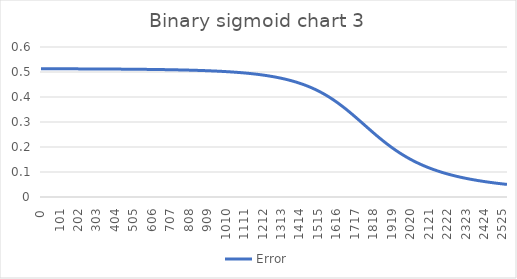
| Category | Error |
|---|---|
| 0.0 | 0.513 |
| 1.0 | 0.513 |
| 2.0 | 0.513 |
| 3.0 | 0.513 |
| 4.0 | 0.513 |
| 5.0 | 0.513 |
| 6.0 | 0.513 |
| 7.0 | 0.513 |
| 8.0 | 0.513 |
| 9.0 | 0.513 |
| 10.0 | 0.513 |
| 11.0 | 0.513 |
| 12.0 | 0.513 |
| 13.0 | 0.513 |
| 14.0 | 0.513 |
| 15.0 | 0.513 |
| 16.0 | 0.513 |
| 17.0 | 0.513 |
| 18.0 | 0.513 |
| 19.0 | 0.513 |
| 20.0 | 0.513 |
| 21.0 | 0.513 |
| 22.0 | 0.513 |
| 23.0 | 0.513 |
| 24.0 | 0.513 |
| 25.0 | 0.513 |
| 26.0 | 0.513 |
| 27.0 | 0.513 |
| 28.0 | 0.513 |
| 29.0 | 0.513 |
| 30.0 | 0.513 |
| 31.0 | 0.513 |
| 32.0 | 0.513 |
| 33.0 | 0.513 |
| 34.0 | 0.513 |
| 35.0 | 0.513 |
| 36.0 | 0.513 |
| 37.0 | 0.513 |
| 38.0 | 0.513 |
| 39.0 | 0.513 |
| 40.0 | 0.513 |
| 41.0 | 0.513 |
| 42.0 | 0.513 |
| 43.0 | 0.513 |
| 44.0 | 0.513 |
| 45.0 | 0.513 |
| 46.0 | 0.513 |
| 47.0 | 0.513 |
| 48.0 | 0.513 |
| 49.0 | 0.513 |
| 50.0 | 0.513 |
| 51.0 | 0.513 |
| 52.0 | 0.513 |
| 53.0 | 0.513 |
| 54.0 | 0.513 |
| 55.0 | 0.513 |
| 56.0 | 0.513 |
| 57.0 | 0.513 |
| 58.0 | 0.513 |
| 59.0 | 0.513 |
| 60.0 | 0.513 |
| 61.0 | 0.513 |
| 62.0 | 0.513 |
| 63.0 | 0.513 |
| 64.0 | 0.513 |
| 65.0 | 0.513 |
| 66.0 | 0.513 |
| 67.0 | 0.513 |
| 68.0 | 0.513 |
| 69.0 | 0.513 |
| 70.0 | 0.513 |
| 71.0 | 0.513 |
| 72.0 | 0.513 |
| 73.0 | 0.513 |
| 74.0 | 0.513 |
| 75.0 | 0.513 |
| 76.0 | 0.513 |
| 77.0 | 0.513 |
| 78.0 | 0.513 |
| 79.0 | 0.513 |
| 80.0 | 0.513 |
| 81.0 | 0.513 |
| 82.0 | 0.513 |
| 83.0 | 0.513 |
| 84.0 | 0.513 |
| 85.0 | 0.513 |
| 86.0 | 0.513 |
| 87.0 | 0.513 |
| 88.0 | 0.513 |
| 89.0 | 0.513 |
| 90.0 | 0.513 |
| 91.0 | 0.513 |
| 92.0 | 0.513 |
| 93.0 | 0.513 |
| 94.0 | 0.513 |
| 95.0 | 0.513 |
| 96.0 | 0.513 |
| 97.0 | 0.513 |
| 98.0 | 0.513 |
| 99.0 | 0.513 |
| 100.0 | 0.513 |
| 101.0 | 0.513 |
| 102.0 | 0.513 |
| 103.0 | 0.513 |
| 104.0 | 0.513 |
| 105.0 | 0.513 |
| 106.0 | 0.513 |
| 107.0 | 0.513 |
| 108.0 | 0.513 |
| 109.0 | 0.513 |
| 110.0 | 0.513 |
| 111.0 | 0.513 |
| 112.0 | 0.513 |
| 113.0 | 0.513 |
| 114.0 | 0.513 |
| 115.0 | 0.513 |
| 116.0 | 0.513 |
| 117.0 | 0.513 |
| 118.0 | 0.513 |
| 119.0 | 0.513 |
| 120.0 | 0.513 |
| 121.0 | 0.513 |
| 122.0 | 0.513 |
| 123.0 | 0.513 |
| 124.0 | 0.513 |
| 125.0 | 0.513 |
| 126.0 | 0.513 |
| 127.0 | 0.513 |
| 128.0 | 0.513 |
| 129.0 | 0.513 |
| 130.0 | 0.513 |
| 131.0 | 0.513 |
| 132.0 | 0.513 |
| 133.0 | 0.513 |
| 134.0 | 0.513 |
| 135.0 | 0.513 |
| 136.0 | 0.513 |
| 137.0 | 0.513 |
| 138.0 | 0.513 |
| 139.0 | 0.513 |
| 140.0 | 0.513 |
| 141.0 | 0.513 |
| 142.0 | 0.513 |
| 143.0 | 0.513 |
| 144.0 | 0.513 |
| 145.0 | 0.513 |
| 146.0 | 0.513 |
| 147.0 | 0.513 |
| 148.0 | 0.513 |
| 149.0 | 0.513 |
| 150.0 | 0.513 |
| 151.0 | 0.513 |
| 152.0 | 0.513 |
| 153.0 | 0.513 |
| 154.0 | 0.513 |
| 155.0 | 0.513 |
| 156.0 | 0.513 |
| 157.0 | 0.513 |
| 158.0 | 0.513 |
| 159.0 | 0.513 |
| 160.0 | 0.513 |
| 161.0 | 0.513 |
| 162.0 | 0.513 |
| 163.0 | 0.513 |
| 164.0 | 0.513 |
| 165.0 | 0.513 |
| 166.0 | 0.513 |
| 167.0 | 0.513 |
| 168.0 | 0.513 |
| 169.0 | 0.513 |
| 170.0 | 0.513 |
| 171.0 | 0.513 |
| 172.0 | 0.513 |
| 173.0 | 0.513 |
| 174.0 | 0.513 |
| 175.0 | 0.513 |
| 176.0 | 0.513 |
| 177.0 | 0.513 |
| 178.0 | 0.513 |
| 179.0 | 0.513 |
| 180.0 | 0.513 |
| 181.0 | 0.513 |
| 182.0 | 0.513 |
| 183.0 | 0.513 |
| 184.0 | 0.513 |
| 185.0 | 0.513 |
| 186.0 | 0.513 |
| 187.0 | 0.513 |
| 188.0 | 0.513 |
| 189.0 | 0.513 |
| 190.0 | 0.513 |
| 191.0 | 0.513 |
| 192.0 | 0.513 |
| 193.0 | 0.513 |
| 194.0 | 0.513 |
| 195.0 | 0.513 |
| 196.0 | 0.513 |
| 197.0 | 0.513 |
| 198.0 | 0.513 |
| 199.0 | 0.513 |
| 200.0 | 0.513 |
| 201.0 | 0.513 |
| 202.0 | 0.513 |
| 203.0 | 0.512 |
| 204.0 | 0.512 |
| 205.0 | 0.512 |
| 206.0 | 0.512 |
| 207.0 | 0.512 |
| 208.0 | 0.512 |
| 209.0 | 0.512 |
| 210.0 | 0.512 |
| 211.0 | 0.512 |
| 212.0 | 0.512 |
| 213.0 | 0.512 |
| 214.0 | 0.512 |
| 215.0 | 0.512 |
| 216.0 | 0.512 |
| 217.0 | 0.512 |
| 218.0 | 0.512 |
| 219.0 | 0.512 |
| 220.0 | 0.512 |
| 221.0 | 0.512 |
| 222.0 | 0.512 |
| 223.0 | 0.512 |
| 224.0 | 0.512 |
| 225.0 | 0.512 |
| 226.0 | 0.512 |
| 227.0 | 0.512 |
| 228.0 | 0.512 |
| 229.0 | 0.512 |
| 230.0 | 0.512 |
| 231.0 | 0.512 |
| 232.0 | 0.512 |
| 233.0 | 0.512 |
| 234.0 | 0.512 |
| 235.0 | 0.512 |
| 236.0 | 0.512 |
| 237.0 | 0.512 |
| 238.0 | 0.512 |
| 239.0 | 0.512 |
| 240.0 | 0.512 |
| 241.0 | 0.512 |
| 242.0 | 0.512 |
| 243.0 | 0.512 |
| 244.0 | 0.512 |
| 245.0 | 0.512 |
| 246.0 | 0.512 |
| 247.0 | 0.512 |
| 248.0 | 0.512 |
| 249.0 | 0.512 |
| 250.0 | 0.512 |
| 251.0 | 0.512 |
| 252.0 | 0.512 |
| 253.0 | 0.512 |
| 254.0 | 0.512 |
| 255.0 | 0.512 |
| 256.0 | 0.512 |
| 257.0 | 0.512 |
| 258.0 | 0.512 |
| 259.0 | 0.512 |
| 260.0 | 0.512 |
| 261.0 | 0.512 |
| 262.0 | 0.512 |
| 263.0 | 0.512 |
| 264.0 | 0.512 |
| 265.0 | 0.512 |
| 266.0 | 0.512 |
| 267.0 | 0.512 |
| 268.0 | 0.512 |
| 269.0 | 0.512 |
| 270.0 | 0.512 |
| 271.0 | 0.512 |
| 272.0 | 0.512 |
| 273.0 | 0.512 |
| 274.0 | 0.512 |
| 275.0 | 0.512 |
| 276.0 | 0.512 |
| 277.0 | 0.512 |
| 278.0 | 0.512 |
| 279.0 | 0.512 |
| 280.0 | 0.512 |
| 281.0 | 0.512 |
| 282.0 | 0.512 |
| 283.0 | 0.512 |
| 284.0 | 0.512 |
| 285.0 | 0.512 |
| 286.0 | 0.512 |
| 287.0 | 0.512 |
| 288.0 | 0.512 |
| 289.0 | 0.512 |
| 290.0 | 0.512 |
| 291.0 | 0.512 |
| 292.0 | 0.512 |
| 293.0 | 0.512 |
| 294.0 | 0.512 |
| 295.0 | 0.512 |
| 296.0 | 0.512 |
| 297.0 | 0.512 |
| 298.0 | 0.512 |
| 299.0 | 0.512 |
| 300.0 | 0.512 |
| 301.0 | 0.512 |
| 302.0 | 0.512 |
| 303.0 | 0.512 |
| 304.0 | 0.512 |
| 305.0 | 0.512 |
| 306.0 | 0.512 |
| 307.0 | 0.512 |
| 308.0 | 0.512 |
| 309.0 | 0.512 |
| 310.0 | 0.512 |
| 311.0 | 0.512 |
| 312.0 | 0.512 |
| 313.0 | 0.512 |
| 314.0 | 0.512 |
| 315.0 | 0.512 |
| 316.0 | 0.512 |
| 317.0 | 0.512 |
| 318.0 | 0.512 |
| 319.0 | 0.512 |
| 320.0 | 0.512 |
| 321.0 | 0.512 |
| 322.0 | 0.512 |
| 323.0 | 0.512 |
| 324.0 | 0.512 |
| 325.0 | 0.512 |
| 326.0 | 0.512 |
| 327.0 | 0.512 |
| 328.0 | 0.512 |
| 329.0 | 0.512 |
| 330.0 | 0.512 |
| 331.0 | 0.512 |
| 332.0 | 0.512 |
| 333.0 | 0.512 |
| 334.0 | 0.512 |
| 335.0 | 0.512 |
| 336.0 | 0.512 |
| 337.0 | 0.512 |
| 338.0 | 0.512 |
| 339.0 | 0.512 |
| 340.0 | 0.512 |
| 341.0 | 0.512 |
| 342.0 | 0.512 |
| 343.0 | 0.512 |
| 344.0 | 0.512 |
| 345.0 | 0.512 |
| 346.0 | 0.512 |
| 347.0 | 0.512 |
| 348.0 | 0.512 |
| 349.0 | 0.512 |
| 350.0 | 0.512 |
| 351.0 | 0.512 |
| 352.0 | 0.512 |
| 353.0 | 0.512 |
| 354.0 | 0.512 |
| 355.0 | 0.512 |
| 356.0 | 0.512 |
| 357.0 | 0.512 |
| 358.0 | 0.512 |
| 359.0 | 0.512 |
| 360.0 | 0.512 |
| 361.0 | 0.512 |
| 362.0 | 0.512 |
| 363.0 | 0.512 |
| 364.0 | 0.512 |
| 365.0 | 0.512 |
| 366.0 | 0.512 |
| 367.0 | 0.512 |
| 368.0 | 0.512 |
| 369.0 | 0.512 |
| 370.0 | 0.512 |
| 371.0 | 0.512 |
| 372.0 | 0.512 |
| 373.0 | 0.512 |
| 374.0 | 0.512 |
| 375.0 | 0.512 |
| 376.0 | 0.512 |
| 377.0 | 0.512 |
| 378.0 | 0.512 |
| 379.0 | 0.512 |
| 380.0 | 0.512 |
| 381.0 | 0.512 |
| 382.0 | 0.512 |
| 383.0 | 0.512 |
| 384.0 | 0.512 |
| 385.0 | 0.512 |
| 386.0 | 0.512 |
| 387.0 | 0.512 |
| 388.0 | 0.512 |
| 389.0 | 0.512 |
| 390.0 | 0.512 |
| 391.0 | 0.512 |
| 392.0 | 0.512 |
| 393.0 | 0.512 |
| 394.0 | 0.512 |
| 395.0 | 0.512 |
| 396.0 | 0.512 |
| 397.0 | 0.512 |
| 398.0 | 0.512 |
| 399.0 | 0.512 |
| 400.0 | 0.512 |
| 401.0 | 0.512 |
| 402.0 | 0.512 |
| 403.0 | 0.512 |
| 404.0 | 0.512 |
| 405.0 | 0.512 |
| 406.0 | 0.512 |
| 407.0 | 0.512 |
| 408.0 | 0.512 |
| 409.0 | 0.512 |
| 410.0 | 0.512 |
| 411.0 | 0.512 |
| 412.0 | 0.512 |
| 413.0 | 0.512 |
| 414.0 | 0.512 |
| 415.0 | 0.512 |
| 416.0 | 0.512 |
| 417.0 | 0.512 |
| 418.0 | 0.512 |
| 419.0 | 0.512 |
| 420.0 | 0.512 |
| 421.0 | 0.512 |
| 422.0 | 0.512 |
| 423.0 | 0.512 |
| 424.0 | 0.512 |
| 425.0 | 0.512 |
| 426.0 | 0.512 |
| 427.0 | 0.512 |
| 428.0 | 0.512 |
| 429.0 | 0.512 |
| 430.0 | 0.512 |
| 431.0 | 0.512 |
| 432.0 | 0.512 |
| 433.0 | 0.512 |
| 434.0 | 0.512 |
| 435.0 | 0.512 |
| 436.0 | 0.511 |
| 437.0 | 0.511 |
| 438.0 | 0.511 |
| 439.0 | 0.511 |
| 440.0 | 0.511 |
| 441.0 | 0.511 |
| 442.0 | 0.511 |
| 443.0 | 0.511 |
| 444.0 | 0.511 |
| 445.0 | 0.511 |
| 446.0 | 0.511 |
| 447.0 | 0.511 |
| 448.0 | 0.511 |
| 449.0 | 0.511 |
| 450.0 | 0.511 |
| 451.0 | 0.511 |
| 452.0 | 0.511 |
| 453.0 | 0.511 |
| 454.0 | 0.511 |
| 455.0 | 0.511 |
| 456.0 | 0.511 |
| 457.0 | 0.511 |
| 458.0 | 0.511 |
| 459.0 | 0.511 |
| 460.0 | 0.511 |
| 461.0 | 0.511 |
| 462.0 | 0.511 |
| 463.0 | 0.511 |
| 464.0 | 0.511 |
| 465.0 | 0.511 |
| 466.0 | 0.511 |
| 467.0 | 0.511 |
| 468.0 | 0.511 |
| 469.0 | 0.511 |
| 470.0 | 0.511 |
| 471.0 | 0.511 |
| 472.0 | 0.511 |
| 473.0 | 0.511 |
| 474.0 | 0.511 |
| 475.0 | 0.511 |
| 476.0 | 0.511 |
| 477.0 | 0.511 |
| 478.0 | 0.511 |
| 479.0 | 0.511 |
| 480.0 | 0.511 |
| 481.0 | 0.511 |
| 482.0 | 0.511 |
| 483.0 | 0.511 |
| 484.0 | 0.511 |
| 485.0 | 0.511 |
| 486.0 | 0.511 |
| 487.0 | 0.511 |
| 488.0 | 0.511 |
| 489.0 | 0.511 |
| 490.0 | 0.511 |
| 491.0 | 0.511 |
| 492.0 | 0.511 |
| 493.0 | 0.511 |
| 494.0 | 0.511 |
| 495.0 | 0.511 |
| 496.0 | 0.511 |
| 497.0 | 0.511 |
| 498.0 | 0.511 |
| 499.0 | 0.511 |
| 500.0 | 0.511 |
| 501.0 | 0.511 |
| 502.0 | 0.511 |
| 503.0 | 0.511 |
| 504.0 | 0.511 |
| 505.0 | 0.511 |
| 506.0 | 0.511 |
| 507.0 | 0.511 |
| 508.0 | 0.511 |
| 509.0 | 0.511 |
| 510.0 | 0.511 |
| 511.0 | 0.511 |
| 512.0 | 0.511 |
| 513.0 | 0.511 |
| 514.0 | 0.511 |
| 515.0 | 0.511 |
| 516.0 | 0.511 |
| 517.0 | 0.511 |
| 518.0 | 0.511 |
| 519.0 | 0.511 |
| 520.0 | 0.511 |
| 521.0 | 0.511 |
| 522.0 | 0.511 |
| 523.0 | 0.511 |
| 524.0 | 0.511 |
| 525.0 | 0.511 |
| 526.0 | 0.511 |
| 527.0 | 0.511 |
| 528.0 | 0.511 |
| 529.0 | 0.511 |
| 530.0 | 0.511 |
| 531.0 | 0.511 |
| 532.0 | 0.511 |
| 533.0 | 0.511 |
| 534.0 | 0.511 |
| 535.0 | 0.511 |
| 536.0 | 0.511 |
| 537.0 | 0.511 |
| 538.0 | 0.511 |
| 539.0 | 0.511 |
| 540.0 | 0.511 |
| 541.0 | 0.511 |
| 542.0 | 0.511 |
| 543.0 | 0.511 |
| 544.0 | 0.511 |
| 545.0 | 0.511 |
| 546.0 | 0.511 |
| 547.0 | 0.511 |
| 548.0 | 0.511 |
| 549.0 | 0.511 |
| 550.0 | 0.511 |
| 551.0 | 0.511 |
| 552.0 | 0.511 |
| 553.0 | 0.511 |
| 554.0 | 0.511 |
| 555.0 | 0.511 |
| 556.0 | 0.511 |
| 557.0 | 0.511 |
| 558.0 | 0.511 |
| 559.0 | 0.511 |
| 560.0 | 0.511 |
| 561.0 | 0.511 |
| 562.0 | 0.511 |
| 563.0 | 0.511 |
| 564.0 | 0.511 |
| 565.0 | 0.511 |
| 566.0 | 0.511 |
| 567.0 | 0.511 |
| 568.0 | 0.511 |
| 569.0 | 0.511 |
| 570.0 | 0.511 |
| 571.0 | 0.511 |
| 572.0 | 0.511 |
| 573.0 | 0.511 |
| 574.0 | 0.511 |
| 575.0 | 0.511 |
| 576.0 | 0.511 |
| 577.0 | 0.511 |
| 578.0 | 0.51 |
| 579.0 | 0.51 |
| 580.0 | 0.51 |
| 581.0 | 0.51 |
| 582.0 | 0.51 |
| 583.0 | 0.51 |
| 584.0 | 0.51 |
| 585.0 | 0.51 |
| 586.0 | 0.51 |
| 587.0 | 0.51 |
| 588.0 | 0.51 |
| 589.0 | 0.51 |
| 590.0 | 0.51 |
| 591.0 | 0.51 |
| 592.0 | 0.51 |
| 593.0 | 0.51 |
| 594.0 | 0.51 |
| 595.0 | 0.51 |
| 596.0 | 0.51 |
| 597.0 | 0.51 |
| 598.0 | 0.51 |
| 599.0 | 0.51 |
| 600.0 | 0.51 |
| 601.0 | 0.51 |
| 602.0 | 0.51 |
| 603.0 | 0.51 |
| 604.0 | 0.51 |
| 605.0 | 0.51 |
| 606.0 | 0.51 |
| 607.0 | 0.51 |
| 608.0 | 0.51 |
| 609.0 | 0.51 |
| 610.0 | 0.51 |
| 611.0 | 0.51 |
| 612.0 | 0.51 |
| 613.0 | 0.51 |
| 614.0 | 0.51 |
| 615.0 | 0.51 |
| 616.0 | 0.51 |
| 617.0 | 0.51 |
| 618.0 | 0.51 |
| 619.0 | 0.51 |
| 620.0 | 0.51 |
| 621.0 | 0.51 |
| 622.0 | 0.51 |
| 623.0 | 0.51 |
| 624.0 | 0.51 |
| 625.0 | 0.51 |
| 626.0 | 0.51 |
| 627.0 | 0.51 |
| 628.0 | 0.51 |
| 629.0 | 0.51 |
| 630.0 | 0.51 |
| 631.0 | 0.51 |
| 632.0 | 0.51 |
| 633.0 | 0.51 |
| 634.0 | 0.51 |
| 635.0 | 0.51 |
| 636.0 | 0.51 |
| 637.0 | 0.51 |
| 638.0 | 0.51 |
| 639.0 | 0.51 |
| 640.0 | 0.51 |
| 641.0 | 0.51 |
| 642.0 | 0.51 |
| 643.0 | 0.51 |
| 644.0 | 0.51 |
| 645.0 | 0.51 |
| 646.0 | 0.51 |
| 647.0 | 0.51 |
| 648.0 | 0.51 |
| 649.0 | 0.51 |
| 650.0 | 0.51 |
| 651.0 | 0.51 |
| 652.0 | 0.51 |
| 653.0 | 0.51 |
| 654.0 | 0.51 |
| 655.0 | 0.51 |
| 656.0 | 0.51 |
| 657.0 | 0.51 |
| 658.0 | 0.51 |
| 659.0 | 0.51 |
| 660.0 | 0.51 |
| 661.0 | 0.51 |
| 662.0 | 0.51 |
| 663.0 | 0.51 |
| 664.0 | 0.51 |
| 665.0 | 0.51 |
| 666.0 | 0.51 |
| 667.0 | 0.51 |
| 668.0 | 0.51 |
| 669.0 | 0.51 |
| 670.0 | 0.51 |
| 671.0 | 0.51 |
| 672.0 | 0.51 |
| 673.0 | 0.51 |
| 674.0 | 0.51 |
| 675.0 | 0.51 |
| 676.0 | 0.51 |
| 677.0 | 0.509 |
| 678.0 | 0.509 |
| 679.0 | 0.509 |
| 680.0 | 0.509 |
| 681.0 | 0.509 |
| 682.0 | 0.509 |
| 683.0 | 0.509 |
| 684.0 | 0.509 |
| 685.0 | 0.509 |
| 686.0 | 0.509 |
| 687.0 | 0.509 |
| 688.0 | 0.509 |
| 689.0 | 0.509 |
| 690.0 | 0.509 |
| 691.0 | 0.509 |
| 692.0 | 0.509 |
| 693.0 | 0.509 |
| 694.0 | 0.509 |
| 695.0 | 0.509 |
| 696.0 | 0.509 |
| 697.0 | 0.509 |
| 698.0 | 0.509 |
| 699.0 | 0.509 |
| 700.0 | 0.509 |
| 701.0 | 0.509 |
| 702.0 | 0.509 |
| 703.0 | 0.509 |
| 704.0 | 0.509 |
| 705.0 | 0.509 |
| 706.0 | 0.509 |
| 707.0 | 0.509 |
| 708.0 | 0.509 |
| 709.0 | 0.509 |
| 710.0 | 0.509 |
| 711.0 | 0.509 |
| 712.0 | 0.509 |
| 713.0 | 0.509 |
| 714.0 | 0.509 |
| 715.0 | 0.509 |
| 716.0 | 0.509 |
| 717.0 | 0.509 |
| 718.0 | 0.509 |
| 719.0 | 0.509 |
| 720.0 | 0.509 |
| 721.0 | 0.509 |
| 722.0 | 0.509 |
| 723.0 | 0.509 |
| 724.0 | 0.509 |
| 725.0 | 0.509 |
| 726.0 | 0.509 |
| 727.0 | 0.509 |
| 728.0 | 0.509 |
| 729.0 | 0.509 |
| 730.0 | 0.509 |
| 731.0 | 0.509 |
| 732.0 | 0.509 |
| 733.0 | 0.509 |
| 734.0 | 0.509 |
| 735.0 | 0.509 |
| 736.0 | 0.509 |
| 737.0 | 0.509 |
| 738.0 | 0.509 |
| 739.0 | 0.509 |
| 740.0 | 0.509 |
| 741.0 | 0.509 |
| 742.0 | 0.509 |
| 743.0 | 0.509 |
| 744.0 | 0.509 |
| 745.0 | 0.509 |
| 746.0 | 0.509 |
| 747.0 | 0.509 |
| 748.0 | 0.509 |
| 749.0 | 0.509 |
| 750.0 | 0.509 |
| 751.0 | 0.508 |
| 752.0 | 0.508 |
| 753.0 | 0.508 |
| 754.0 | 0.508 |
| 755.0 | 0.508 |
| 756.0 | 0.508 |
| 757.0 | 0.508 |
| 758.0 | 0.508 |
| 759.0 | 0.508 |
| 760.0 | 0.508 |
| 761.0 | 0.508 |
| 762.0 | 0.508 |
| 763.0 | 0.508 |
| 764.0 | 0.508 |
| 765.0 | 0.508 |
| 766.0 | 0.508 |
| 767.0 | 0.508 |
| 768.0 | 0.508 |
| 769.0 | 0.508 |
| 770.0 | 0.508 |
| 771.0 | 0.508 |
| 772.0 | 0.508 |
| 773.0 | 0.508 |
| 774.0 | 0.508 |
| 775.0 | 0.508 |
| 776.0 | 0.508 |
| 777.0 | 0.508 |
| 778.0 | 0.508 |
| 779.0 | 0.508 |
| 780.0 | 0.508 |
| 781.0 | 0.508 |
| 782.0 | 0.508 |
| 783.0 | 0.508 |
| 784.0 | 0.508 |
| 785.0 | 0.508 |
| 786.0 | 0.508 |
| 787.0 | 0.508 |
| 788.0 | 0.508 |
| 789.0 | 0.508 |
| 790.0 | 0.508 |
| 791.0 | 0.508 |
| 792.0 | 0.508 |
| 793.0 | 0.508 |
| 794.0 | 0.508 |
| 795.0 | 0.508 |
| 796.0 | 0.508 |
| 797.0 | 0.508 |
| 798.0 | 0.508 |
| 799.0 | 0.508 |
| 800.0 | 0.508 |
| 801.0 | 0.508 |
| 802.0 | 0.508 |
| 803.0 | 0.508 |
| 804.0 | 0.508 |
| 805.0 | 0.508 |
| 806.0 | 0.508 |
| 807.0 | 0.508 |
| 808.0 | 0.508 |
| 809.0 | 0.507 |
| 810.0 | 0.507 |
| 811.0 | 0.507 |
| 812.0 | 0.507 |
| 813.0 | 0.507 |
| 814.0 | 0.507 |
| 815.0 | 0.507 |
| 816.0 | 0.507 |
| 817.0 | 0.507 |
| 818.0 | 0.507 |
| 819.0 | 0.507 |
| 820.0 | 0.507 |
| 821.0 | 0.507 |
| 822.0 | 0.507 |
| 823.0 | 0.507 |
| 824.0 | 0.507 |
| 825.0 | 0.507 |
| 826.0 | 0.507 |
| 827.0 | 0.507 |
| 828.0 | 0.507 |
| 829.0 | 0.507 |
| 830.0 | 0.507 |
| 831.0 | 0.507 |
| 832.0 | 0.507 |
| 833.0 | 0.507 |
| 834.0 | 0.507 |
| 835.0 | 0.507 |
| 836.0 | 0.507 |
| 837.0 | 0.507 |
| 838.0 | 0.507 |
| 839.0 | 0.507 |
| 840.0 | 0.507 |
| 841.0 | 0.507 |
| 842.0 | 0.507 |
| 843.0 | 0.507 |
| 844.0 | 0.507 |
| 845.0 | 0.507 |
| 846.0 | 0.507 |
| 847.0 | 0.507 |
| 848.0 | 0.507 |
| 849.0 | 0.507 |
| 850.0 | 0.507 |
| 851.0 | 0.507 |
| 852.0 | 0.507 |
| 853.0 | 0.507 |
| 854.0 | 0.507 |
| 855.0 | 0.507 |
| 856.0 | 0.507 |
| 857.0 | 0.506 |
| 858.0 | 0.506 |
| 859.0 | 0.506 |
| 860.0 | 0.506 |
| 861.0 | 0.506 |
| 862.0 | 0.506 |
| 863.0 | 0.506 |
| 864.0 | 0.506 |
| 865.0 | 0.506 |
| 866.0 | 0.506 |
| 867.0 | 0.506 |
| 868.0 | 0.506 |
| 869.0 | 0.506 |
| 870.0 | 0.506 |
| 871.0 | 0.506 |
| 872.0 | 0.506 |
| 873.0 | 0.506 |
| 874.0 | 0.506 |
| 875.0 | 0.506 |
| 876.0 | 0.506 |
| 877.0 | 0.506 |
| 878.0 | 0.506 |
| 879.0 | 0.506 |
| 880.0 | 0.506 |
| 881.0 | 0.506 |
| 882.0 | 0.506 |
| 883.0 | 0.506 |
| 884.0 | 0.506 |
| 885.0 | 0.506 |
| 886.0 | 0.506 |
| 887.0 | 0.506 |
| 888.0 | 0.506 |
| 889.0 | 0.506 |
| 890.0 | 0.506 |
| 891.0 | 0.506 |
| 892.0 | 0.506 |
| 893.0 | 0.506 |
| 894.0 | 0.506 |
| 895.0 | 0.506 |
| 896.0 | 0.506 |
| 897.0 | 0.505 |
| 898.0 | 0.505 |
| 899.0 | 0.505 |
| 900.0 | 0.505 |
| 901.0 | 0.505 |
| 902.0 | 0.505 |
| 903.0 | 0.505 |
| 904.0 | 0.505 |
| 905.0 | 0.505 |
| 906.0 | 0.505 |
| 907.0 | 0.505 |
| 908.0 | 0.505 |
| 909.0 | 0.505 |
| 910.0 | 0.505 |
| 911.0 | 0.505 |
| 912.0 | 0.505 |
| 913.0 | 0.505 |
| 914.0 | 0.505 |
| 915.0 | 0.505 |
| 916.0 | 0.505 |
| 917.0 | 0.505 |
| 918.0 | 0.505 |
| 919.0 | 0.505 |
| 920.0 | 0.505 |
| 921.0 | 0.505 |
| 922.0 | 0.505 |
| 923.0 | 0.505 |
| 924.0 | 0.505 |
| 925.0 | 0.505 |
| 926.0 | 0.505 |
| 927.0 | 0.505 |
| 928.0 | 0.505 |
| 929.0 | 0.505 |
| 930.0 | 0.505 |
| 931.0 | 0.505 |
| 932.0 | 0.504 |
| 933.0 | 0.504 |
| 934.0 | 0.504 |
| 935.0 | 0.504 |
| 936.0 | 0.504 |
| 937.0 | 0.504 |
| 938.0 | 0.504 |
| 939.0 | 0.504 |
| 940.0 | 0.504 |
| 941.0 | 0.504 |
| 942.0 | 0.504 |
| 943.0 | 0.504 |
| 944.0 | 0.504 |
| 945.0 | 0.504 |
| 946.0 | 0.504 |
| 947.0 | 0.504 |
| 948.0 | 0.504 |
| 949.0 | 0.504 |
| 950.0 | 0.504 |
| 951.0 | 0.504 |
| 952.0 | 0.504 |
| 953.0 | 0.504 |
| 954.0 | 0.504 |
| 955.0 | 0.504 |
| 956.0 | 0.504 |
| 957.0 | 0.504 |
| 958.0 | 0.504 |
| 959.0 | 0.504 |
| 960.0 | 0.504 |
| 961.0 | 0.504 |
| 962.0 | 0.504 |
| 963.0 | 0.503 |
| 964.0 | 0.503 |
| 965.0 | 0.503 |
| 966.0 | 0.503 |
| 967.0 | 0.503 |
| 968.0 | 0.503 |
| 969.0 | 0.503 |
| 970.0 | 0.503 |
| 971.0 | 0.503 |
| 972.0 | 0.503 |
| 973.0 | 0.503 |
| 974.0 | 0.503 |
| 975.0 | 0.503 |
| 976.0 | 0.503 |
| 977.0 | 0.503 |
| 978.0 | 0.503 |
| 979.0 | 0.503 |
| 980.0 | 0.503 |
| 981.0 | 0.503 |
| 982.0 | 0.503 |
| 983.0 | 0.503 |
| 984.0 | 0.503 |
| 985.0 | 0.503 |
| 986.0 | 0.503 |
| 987.0 | 0.503 |
| 988.0 | 0.503 |
| 989.0 | 0.503 |
| 990.0 | 0.502 |
| 991.0 | 0.502 |
| 992.0 | 0.502 |
| 993.0 | 0.502 |
| 994.0 | 0.502 |
| 995.0 | 0.502 |
| 996.0 | 0.502 |
| 997.0 | 0.502 |
| 998.0 | 0.502 |
| 999.0 | 0.502 |
| 1000.0 | 0.502 |
| 1001.0 | 0.502 |
| 1002.0 | 0.502 |
| 1003.0 | 0.502 |
| 1004.0 | 0.502 |
| 1005.0 | 0.502 |
| 1006.0 | 0.502 |
| 1007.0 | 0.502 |
| 1008.0 | 0.502 |
| 1009.0 | 0.502 |
| 1010.0 | 0.502 |
| 1011.0 | 0.502 |
| 1012.0 | 0.502 |
| 1013.0 | 0.502 |
| 1014.0 | 0.501 |
| 1015.0 | 0.501 |
| 1016.0 | 0.501 |
| 1017.0 | 0.501 |
| 1018.0 | 0.501 |
| 1019.0 | 0.501 |
| 1020.0 | 0.501 |
| 1021.0 | 0.501 |
| 1022.0 | 0.501 |
| 1023.0 | 0.501 |
| 1024.0 | 0.501 |
| 1025.0 | 0.501 |
| 1026.0 | 0.501 |
| 1027.0 | 0.501 |
| 1028.0 | 0.501 |
| 1029.0 | 0.501 |
| 1030.0 | 0.501 |
| 1031.0 | 0.501 |
| 1032.0 | 0.501 |
| 1033.0 | 0.501 |
| 1034.0 | 0.501 |
| 1035.0 | 0.501 |
| 1036.0 | 0.5 |
| 1037.0 | 0.5 |
| 1038.0 | 0.5 |
| 1039.0 | 0.5 |
| 1040.0 | 0.5 |
| 1041.0 | 0.5 |
| 1042.0 | 0.5 |
| 1043.0 | 0.5 |
| 1044.0 | 0.5 |
| 1045.0 | 0.5 |
| 1046.0 | 0.5 |
| 1047.0 | 0.5 |
| 1048.0 | 0.5 |
| 1049.0 | 0.5 |
| 1050.0 | 0.5 |
| 1051.0 | 0.5 |
| 1052.0 | 0.5 |
| 1053.0 | 0.5 |
| 1054.0 | 0.5 |
| 1055.0 | 0.5 |
| 1056.0 | 0.499 |
| 1057.0 | 0.499 |
| 1058.0 | 0.499 |
| 1059.0 | 0.499 |
| 1060.0 | 0.499 |
| 1061.0 | 0.499 |
| 1062.0 | 0.499 |
| 1063.0 | 0.499 |
| 1064.0 | 0.499 |
| 1065.0 | 0.499 |
| 1066.0 | 0.499 |
| 1067.0 | 0.499 |
| 1068.0 | 0.499 |
| 1069.0 | 0.499 |
| 1070.0 | 0.499 |
| 1071.0 | 0.499 |
| 1072.0 | 0.499 |
| 1073.0 | 0.499 |
| 1074.0 | 0.499 |
| 1075.0 | 0.498 |
| 1076.0 | 0.498 |
| 1077.0 | 0.498 |
| 1078.0 | 0.498 |
| 1079.0 | 0.498 |
| 1080.0 | 0.498 |
| 1081.0 | 0.498 |
| 1082.0 | 0.498 |
| 1083.0 | 0.498 |
| 1084.0 | 0.498 |
| 1085.0 | 0.498 |
| 1086.0 | 0.498 |
| 1087.0 | 0.498 |
| 1088.0 | 0.498 |
| 1089.0 | 0.498 |
| 1090.0 | 0.498 |
| 1091.0 | 0.498 |
| 1092.0 | 0.497 |
| 1093.0 | 0.497 |
| 1094.0 | 0.497 |
| 1095.0 | 0.497 |
| 1096.0 | 0.497 |
| 1097.0 | 0.497 |
| 1098.0 | 0.497 |
| 1099.0 | 0.497 |
| 1100.0 | 0.497 |
| 1101.0 | 0.497 |
| 1102.0 | 0.497 |
| 1103.0 | 0.497 |
| 1104.0 | 0.497 |
| 1105.0 | 0.497 |
| 1106.0 | 0.497 |
| 1107.0 | 0.497 |
| 1108.0 | 0.496 |
| 1109.0 | 0.496 |
| 1110.0 | 0.496 |
| 1111.0 | 0.496 |
| 1112.0 | 0.496 |
| 1113.0 | 0.496 |
| 1114.0 | 0.496 |
| 1115.0 | 0.496 |
| 1116.0 | 0.496 |
| 1117.0 | 0.496 |
| 1118.0 | 0.496 |
| 1119.0 | 0.496 |
| 1120.0 | 0.496 |
| 1121.0 | 0.496 |
| 1122.0 | 0.496 |
| 1123.0 | 0.495 |
| 1124.0 | 0.495 |
| 1125.0 | 0.495 |
| 1126.0 | 0.495 |
| 1127.0 | 0.495 |
| 1128.0 | 0.495 |
| 1129.0 | 0.495 |
| 1130.0 | 0.495 |
| 1131.0 | 0.495 |
| 1132.0 | 0.495 |
| 1133.0 | 0.495 |
| 1134.0 | 0.495 |
| 1135.0 | 0.495 |
| 1136.0 | 0.495 |
| 1137.0 | 0.494 |
| 1138.0 | 0.494 |
| 1139.0 | 0.494 |
| 1140.0 | 0.494 |
| 1141.0 | 0.494 |
| 1142.0 | 0.494 |
| 1143.0 | 0.494 |
| 1144.0 | 0.494 |
| 1145.0 | 0.494 |
| 1146.0 | 0.494 |
| 1147.0 | 0.494 |
| 1148.0 | 0.494 |
| 1149.0 | 0.494 |
| 1150.0 | 0.494 |
| 1151.0 | 0.493 |
| 1152.0 | 0.493 |
| 1153.0 | 0.493 |
| 1154.0 | 0.493 |
| 1155.0 | 0.493 |
| 1156.0 | 0.493 |
| 1157.0 | 0.493 |
| 1158.0 | 0.493 |
| 1159.0 | 0.493 |
| 1160.0 | 0.493 |
| 1161.0 | 0.493 |
| 1162.0 | 0.493 |
| 1163.0 | 0.492 |
| 1164.0 | 0.492 |
| 1165.0 | 0.492 |
| 1166.0 | 0.492 |
| 1167.0 | 0.492 |
| 1168.0 | 0.492 |
| 1169.0 | 0.492 |
| 1170.0 | 0.492 |
| 1171.0 | 0.492 |
| 1172.0 | 0.492 |
| 1173.0 | 0.492 |
| 1174.0 | 0.492 |
| 1175.0 | 0.491 |
| 1176.0 | 0.491 |
| 1177.0 | 0.491 |
| 1178.0 | 0.491 |
| 1179.0 | 0.491 |
| 1180.0 | 0.491 |
| 1181.0 | 0.491 |
| 1182.0 | 0.491 |
| 1183.0 | 0.491 |
| 1184.0 | 0.491 |
| 1185.0 | 0.491 |
| 1186.0 | 0.49 |
| 1187.0 | 0.49 |
| 1188.0 | 0.49 |
| 1189.0 | 0.49 |
| 1190.0 | 0.49 |
| 1191.0 | 0.49 |
| 1192.0 | 0.49 |
| 1193.0 | 0.49 |
| 1194.0 | 0.49 |
| 1195.0 | 0.49 |
| 1196.0 | 0.49 |
| 1197.0 | 0.489 |
| 1198.0 | 0.489 |
| 1199.0 | 0.489 |
| 1200.0 | 0.489 |
| 1201.0 | 0.489 |
| 1202.0 | 0.489 |
| 1203.0 | 0.489 |
| 1204.0 | 0.489 |
| 1205.0 | 0.489 |
| 1206.0 | 0.489 |
| 1207.0 | 0.489 |
| 1208.0 | 0.488 |
| 1209.0 | 0.488 |
| 1210.0 | 0.488 |
| 1211.0 | 0.488 |
| 1212.0 | 0.488 |
| 1213.0 | 0.488 |
| 1214.0 | 0.488 |
| 1215.0 | 0.488 |
| 1216.0 | 0.488 |
| 1217.0 | 0.487 |
| 1218.0 | 0.487 |
| 1219.0 | 0.487 |
| 1220.0 | 0.487 |
| 1221.0 | 0.487 |
| 1222.0 | 0.487 |
| 1223.0 | 0.487 |
| 1224.0 | 0.487 |
| 1225.0 | 0.487 |
| 1226.0 | 0.487 |
| 1227.0 | 0.486 |
| 1228.0 | 0.486 |
| 1229.0 | 0.486 |
| 1230.0 | 0.486 |
| 1231.0 | 0.486 |
| 1232.0 | 0.486 |
| 1233.0 | 0.486 |
| 1234.0 | 0.486 |
| 1235.0 | 0.486 |
| 1236.0 | 0.485 |
| 1237.0 | 0.485 |
| 1238.0 | 0.485 |
| 1239.0 | 0.485 |
| 1240.0 | 0.485 |
| 1241.0 | 0.485 |
| 1242.0 | 0.485 |
| 1243.0 | 0.485 |
| 1244.0 | 0.485 |
| 1245.0 | 0.484 |
| 1246.0 | 0.484 |
| 1247.0 | 0.484 |
| 1248.0 | 0.484 |
| 1249.0 | 0.484 |
| 1250.0 | 0.484 |
| 1251.0 | 0.484 |
| 1252.0 | 0.484 |
| 1253.0 | 0.483 |
| 1254.0 | 0.483 |
| 1255.0 | 0.483 |
| 1256.0 | 0.483 |
| 1257.0 | 0.483 |
| 1258.0 | 0.483 |
| 1259.0 | 0.483 |
| 1260.0 | 0.483 |
| 1261.0 | 0.482 |
| 1262.0 | 0.482 |
| 1263.0 | 0.482 |
| 1264.0 | 0.482 |
| 1265.0 | 0.482 |
| 1266.0 | 0.482 |
| 1267.0 | 0.482 |
| 1268.0 | 0.482 |
| 1269.0 | 0.481 |
| 1270.0 | 0.481 |
| 1271.0 | 0.481 |
| 1272.0 | 0.481 |
| 1273.0 | 0.481 |
| 1274.0 | 0.481 |
| 1275.0 | 0.481 |
| 1276.0 | 0.481 |
| 1277.0 | 0.48 |
| 1278.0 | 0.48 |
| 1279.0 | 0.48 |
| 1280.0 | 0.48 |
| 1281.0 | 0.48 |
| 1282.0 | 0.48 |
| 1283.0 | 0.48 |
| 1284.0 | 0.479 |
| 1285.0 | 0.479 |
| 1286.0 | 0.479 |
| 1287.0 | 0.479 |
| 1288.0 | 0.479 |
| 1289.0 | 0.479 |
| 1290.0 | 0.479 |
| 1291.0 | 0.478 |
| 1292.0 | 0.478 |
| 1293.0 | 0.478 |
| 1294.0 | 0.478 |
| 1295.0 | 0.478 |
| 1296.0 | 0.478 |
| 1297.0 | 0.478 |
| 1298.0 | 0.477 |
| 1299.0 | 0.477 |
| 1300.0 | 0.477 |
| 1301.0 | 0.477 |
| 1302.0 | 0.477 |
| 1303.0 | 0.477 |
| 1304.0 | 0.477 |
| 1305.0 | 0.476 |
| 1306.0 | 0.476 |
| 1307.0 | 0.476 |
| 1308.0 | 0.476 |
| 1309.0 | 0.476 |
| 1310.0 | 0.476 |
| 1311.0 | 0.475 |
| 1312.0 | 0.475 |
| 1313.0 | 0.475 |
| 1314.0 | 0.475 |
| 1315.0 | 0.475 |
| 1316.0 | 0.475 |
| 1317.0 | 0.475 |
| 1318.0 | 0.474 |
| 1319.0 | 0.474 |
| 1320.0 | 0.474 |
| 1321.0 | 0.474 |
| 1322.0 | 0.474 |
| 1323.0 | 0.474 |
| 1324.0 | 0.473 |
| 1325.0 | 0.473 |
| 1326.0 | 0.473 |
| 1327.0 | 0.473 |
| 1328.0 | 0.473 |
| 1329.0 | 0.473 |
| 1330.0 | 0.472 |
| 1331.0 | 0.472 |
| 1332.0 | 0.472 |
| 1333.0 | 0.472 |
| 1334.0 | 0.472 |
| 1335.0 | 0.472 |
| 1336.0 | 0.471 |
| 1337.0 | 0.471 |
| 1338.0 | 0.471 |
| 1339.0 | 0.471 |
| 1340.0 | 0.471 |
| 1341.0 | 0.471 |
| 1342.0 | 0.47 |
| 1343.0 | 0.47 |
| 1344.0 | 0.47 |
| 1345.0 | 0.47 |
| 1346.0 | 0.47 |
| 1347.0 | 0.469 |
| 1348.0 | 0.469 |
| 1349.0 | 0.469 |
| 1350.0 | 0.469 |
| 1351.0 | 0.469 |
| 1352.0 | 0.469 |
| 1353.0 | 0.468 |
| 1354.0 | 0.468 |
| 1355.0 | 0.468 |
| 1356.0 | 0.468 |
| 1357.0 | 0.468 |
| 1358.0 | 0.467 |
| 1359.0 | 0.467 |
| 1360.0 | 0.467 |
| 1361.0 | 0.467 |
| 1362.0 | 0.467 |
| 1363.0 | 0.466 |
| 1364.0 | 0.466 |
| 1365.0 | 0.466 |
| 1366.0 | 0.466 |
| 1367.0 | 0.466 |
| 1368.0 | 0.465 |
| 1369.0 | 0.465 |
| 1370.0 | 0.465 |
| 1371.0 | 0.465 |
| 1372.0 | 0.465 |
| 1373.0 | 0.464 |
| 1374.0 | 0.464 |
| 1375.0 | 0.464 |
| 1376.0 | 0.464 |
| 1377.0 | 0.464 |
| 1378.0 | 0.463 |
| 1379.0 | 0.463 |
| 1380.0 | 0.463 |
| 1381.0 | 0.463 |
| 1382.0 | 0.463 |
| 1383.0 | 0.462 |
| 1384.0 | 0.462 |
| 1385.0 | 0.462 |
| 1386.0 | 0.462 |
| 1387.0 | 0.462 |
| 1388.0 | 0.461 |
| 1389.0 | 0.461 |
| 1390.0 | 0.461 |
| 1391.0 | 0.461 |
| 1392.0 | 0.46 |
| 1393.0 | 0.46 |
| 1394.0 | 0.46 |
| 1395.0 | 0.46 |
| 1396.0 | 0.46 |
| 1397.0 | 0.459 |
| 1398.0 | 0.459 |
| 1399.0 | 0.459 |
| 1400.0 | 0.459 |
| 1401.0 | 0.458 |
| 1402.0 | 0.458 |
| 1403.0 | 0.458 |
| 1404.0 | 0.458 |
| 1405.0 | 0.457 |
| 1406.0 | 0.457 |
| 1407.0 | 0.457 |
| 1408.0 | 0.457 |
| 1409.0 | 0.457 |
| 1410.0 | 0.456 |
| 1411.0 | 0.456 |
| 1412.0 | 0.456 |
| 1413.0 | 0.456 |
| 1414.0 | 0.455 |
| 1415.0 | 0.455 |
| 1416.0 | 0.455 |
| 1417.0 | 0.455 |
| 1418.0 | 0.454 |
| 1419.0 | 0.454 |
| 1420.0 | 0.454 |
| 1421.0 | 0.454 |
| 1422.0 | 0.453 |
| 1423.0 | 0.453 |
| 1424.0 | 0.453 |
| 1425.0 | 0.453 |
| 1426.0 | 0.452 |
| 1427.0 | 0.452 |
| 1428.0 | 0.452 |
| 1429.0 | 0.452 |
| 1430.0 | 0.451 |
| 1431.0 | 0.451 |
| 1432.0 | 0.451 |
| 1433.0 | 0.451 |
| 1434.0 | 0.45 |
| 1435.0 | 0.45 |
| 1436.0 | 0.45 |
| 1437.0 | 0.45 |
| 1438.0 | 0.449 |
| 1439.0 | 0.449 |
| 1440.0 | 0.449 |
| 1441.0 | 0.448 |
| 1442.0 | 0.448 |
| 1443.0 | 0.448 |
| 1444.0 | 0.448 |
| 1445.0 | 0.447 |
| 1446.0 | 0.447 |
| 1447.0 | 0.447 |
| 1448.0 | 0.447 |
| 1449.0 | 0.446 |
| 1450.0 | 0.446 |
| 1451.0 | 0.446 |
| 1452.0 | 0.445 |
| 1453.0 | 0.445 |
| 1454.0 | 0.445 |
| 1455.0 | 0.445 |
| 1456.0 | 0.444 |
| 1457.0 | 0.444 |
| 1458.0 | 0.444 |
| 1459.0 | 0.443 |
| 1460.0 | 0.443 |
| 1461.0 | 0.443 |
| 1462.0 | 0.443 |
| 1463.0 | 0.442 |
| 1464.0 | 0.442 |
| 1465.0 | 0.442 |
| 1466.0 | 0.441 |
| 1467.0 | 0.441 |
| 1468.0 | 0.441 |
| 1469.0 | 0.44 |
| 1470.0 | 0.44 |
| 1471.0 | 0.44 |
| 1472.0 | 0.439 |
| 1473.0 | 0.439 |
| 1474.0 | 0.439 |
| 1475.0 | 0.439 |
| 1476.0 | 0.438 |
| 1477.0 | 0.438 |
| 1478.0 | 0.438 |
| 1479.0 | 0.437 |
| 1480.0 | 0.437 |
| 1481.0 | 0.437 |
| 1482.0 | 0.436 |
| 1483.0 | 0.436 |
| 1484.0 | 0.436 |
| 1485.0 | 0.435 |
| 1486.0 | 0.435 |
| 1487.0 | 0.435 |
| 1488.0 | 0.434 |
| 1489.0 | 0.434 |
| 1490.0 | 0.434 |
| 1491.0 | 0.433 |
| 1492.0 | 0.433 |
| 1493.0 | 0.433 |
| 1494.0 | 0.432 |
| 1495.0 | 0.432 |
| 1496.0 | 0.432 |
| 1497.0 | 0.431 |
| 1498.0 | 0.431 |
| 1499.0 | 0.431 |
| 1500.0 | 0.43 |
| 1501.0 | 0.43 |
| 1502.0 | 0.43 |
| 1503.0 | 0.429 |
| 1504.0 | 0.429 |
| 1505.0 | 0.429 |
| 1506.0 | 0.428 |
| 1507.0 | 0.428 |
| 1508.0 | 0.428 |
| 1509.0 | 0.427 |
| 1510.0 | 0.427 |
| 1511.0 | 0.426 |
| 1512.0 | 0.426 |
| 1513.0 | 0.426 |
| 1514.0 | 0.425 |
| 1515.0 | 0.425 |
| 1516.0 | 0.425 |
| 1517.0 | 0.424 |
| 1518.0 | 0.424 |
| 1519.0 | 0.424 |
| 1520.0 | 0.423 |
| 1521.0 | 0.423 |
| 1522.0 | 0.422 |
| 1523.0 | 0.422 |
| 1524.0 | 0.422 |
| 1525.0 | 0.421 |
| 1526.0 | 0.421 |
| 1527.0 | 0.421 |
| 1528.0 | 0.42 |
| 1529.0 | 0.42 |
| 1530.0 | 0.419 |
| 1531.0 | 0.419 |
| 1532.0 | 0.419 |
| 1533.0 | 0.418 |
| 1534.0 | 0.418 |
| 1535.0 | 0.417 |
| 1536.0 | 0.417 |
| 1537.0 | 0.417 |
| 1538.0 | 0.416 |
| 1539.0 | 0.416 |
| 1540.0 | 0.415 |
| 1541.0 | 0.415 |
| 1542.0 | 0.415 |
| 1543.0 | 0.414 |
| 1544.0 | 0.414 |
| 1545.0 | 0.413 |
| 1546.0 | 0.413 |
| 1547.0 | 0.413 |
| 1548.0 | 0.412 |
| 1549.0 | 0.412 |
| 1550.0 | 0.411 |
| 1551.0 | 0.411 |
| 1552.0 | 0.41 |
| 1553.0 | 0.41 |
| 1554.0 | 0.41 |
| 1555.0 | 0.409 |
| 1556.0 | 0.409 |
| 1557.0 | 0.408 |
| 1558.0 | 0.408 |
| 1559.0 | 0.407 |
| 1560.0 | 0.407 |
| 1561.0 | 0.407 |
| 1562.0 | 0.406 |
| 1563.0 | 0.406 |
| 1564.0 | 0.405 |
| 1565.0 | 0.405 |
| 1566.0 | 0.404 |
| 1567.0 | 0.404 |
| 1568.0 | 0.404 |
| 1569.0 | 0.403 |
| 1570.0 | 0.403 |
| 1571.0 | 0.402 |
| 1572.0 | 0.402 |
| 1573.0 | 0.401 |
| 1574.0 | 0.401 |
| 1575.0 | 0.4 |
| 1576.0 | 0.4 |
| 1577.0 | 0.399 |
| 1578.0 | 0.399 |
| 1579.0 | 0.399 |
| 1580.0 | 0.398 |
| 1581.0 | 0.398 |
| 1582.0 | 0.397 |
| 1583.0 | 0.397 |
| 1584.0 | 0.396 |
| 1585.0 | 0.396 |
| 1586.0 | 0.395 |
| 1587.0 | 0.395 |
| 1588.0 | 0.394 |
| 1589.0 | 0.394 |
| 1590.0 | 0.393 |
| 1591.0 | 0.393 |
| 1592.0 | 0.392 |
| 1593.0 | 0.392 |
| 1594.0 | 0.391 |
| 1595.0 | 0.391 |
| 1596.0 | 0.391 |
| 1597.0 | 0.39 |
| 1598.0 | 0.39 |
| 1599.0 | 0.389 |
| 1600.0 | 0.389 |
| 1601.0 | 0.388 |
| 1602.0 | 0.388 |
| 1603.0 | 0.387 |
| 1604.0 | 0.387 |
| 1605.0 | 0.386 |
| 1606.0 | 0.386 |
| 1607.0 | 0.385 |
| 1608.0 | 0.385 |
| 1609.0 | 0.384 |
| 1610.0 | 0.384 |
| 1611.0 | 0.383 |
| 1612.0 | 0.383 |
| 1613.0 | 0.382 |
| 1614.0 | 0.382 |
| 1615.0 | 0.381 |
| 1616.0 | 0.38 |
| 1617.0 | 0.38 |
| 1618.0 | 0.379 |
| 1619.0 | 0.379 |
| 1620.0 | 0.378 |
| 1621.0 | 0.378 |
| 1622.0 | 0.377 |
| 1623.0 | 0.377 |
| 1624.0 | 0.376 |
| 1625.0 | 0.376 |
| 1626.0 | 0.375 |
| 1627.0 | 0.375 |
| 1628.0 | 0.374 |
| 1629.0 | 0.374 |
| 1630.0 | 0.373 |
| 1631.0 | 0.373 |
| 1632.0 | 0.372 |
| 1633.0 | 0.371 |
| 1634.0 | 0.371 |
| 1635.0 | 0.37 |
| 1636.0 | 0.37 |
| 1637.0 | 0.369 |
| 1638.0 | 0.369 |
| 1639.0 | 0.368 |
| 1640.0 | 0.368 |
| 1641.0 | 0.367 |
| 1642.0 | 0.367 |
| 1643.0 | 0.366 |
| 1644.0 | 0.365 |
| 1645.0 | 0.365 |
| 1646.0 | 0.364 |
| 1647.0 | 0.364 |
| 1648.0 | 0.363 |
| 1649.0 | 0.363 |
| 1650.0 | 0.362 |
| 1651.0 | 0.362 |
| 1652.0 | 0.361 |
| 1653.0 | 0.36 |
| 1654.0 | 0.36 |
| 1655.0 | 0.359 |
| 1656.0 | 0.359 |
| 1657.0 | 0.358 |
| 1658.0 | 0.358 |
| 1659.0 | 0.357 |
| 1660.0 | 0.356 |
| 1661.0 | 0.356 |
| 1662.0 | 0.355 |
| 1663.0 | 0.355 |
| 1664.0 | 0.354 |
| 1665.0 | 0.354 |
| 1666.0 | 0.353 |
| 1667.0 | 0.352 |
| 1668.0 | 0.352 |
| 1669.0 | 0.351 |
| 1670.0 | 0.351 |
| 1671.0 | 0.35 |
| 1672.0 | 0.349 |
| 1673.0 | 0.349 |
| 1674.0 | 0.348 |
| 1675.0 | 0.348 |
| 1676.0 | 0.347 |
| 1677.0 | 0.346 |
| 1678.0 | 0.346 |
| 1679.0 | 0.345 |
| 1680.0 | 0.345 |
| 1681.0 | 0.344 |
| 1682.0 | 0.343 |
| 1683.0 | 0.343 |
| 1684.0 | 0.342 |
| 1685.0 | 0.342 |
| 1686.0 | 0.341 |
| 1687.0 | 0.34 |
| 1688.0 | 0.34 |
| 1689.0 | 0.339 |
| 1690.0 | 0.339 |
| 1691.0 | 0.338 |
| 1692.0 | 0.337 |
| 1693.0 | 0.337 |
| 1694.0 | 0.336 |
| 1695.0 | 0.336 |
| 1696.0 | 0.335 |
| 1697.0 | 0.334 |
| 1698.0 | 0.334 |
| 1699.0 | 0.333 |
| 1700.0 | 0.333 |
| 1701.0 | 0.332 |
| 1702.0 | 0.331 |
| 1703.0 | 0.331 |
| 1704.0 | 0.33 |
| 1705.0 | 0.329 |
| 1706.0 | 0.329 |
| 1707.0 | 0.328 |
| 1708.0 | 0.328 |
| 1709.0 | 0.327 |
| 1710.0 | 0.326 |
| 1711.0 | 0.326 |
| 1712.0 | 0.325 |
| 1713.0 | 0.324 |
| 1714.0 | 0.324 |
| 1715.0 | 0.323 |
| 1716.0 | 0.323 |
| 1717.0 | 0.322 |
| 1718.0 | 0.321 |
| 1719.0 | 0.321 |
| 1720.0 | 0.32 |
| 1721.0 | 0.319 |
| 1722.0 | 0.319 |
| 1723.0 | 0.318 |
| 1724.0 | 0.318 |
| 1725.0 | 0.317 |
| 1726.0 | 0.316 |
| 1727.0 | 0.316 |
| 1728.0 | 0.315 |
| 1729.0 | 0.314 |
| 1730.0 | 0.314 |
| 1731.0 | 0.313 |
| 1732.0 | 0.312 |
| 1733.0 | 0.312 |
| 1734.0 | 0.311 |
| 1735.0 | 0.311 |
| 1736.0 | 0.31 |
| 1737.0 | 0.309 |
| 1738.0 | 0.309 |
| 1739.0 | 0.308 |
| 1740.0 | 0.307 |
| 1741.0 | 0.307 |
| 1742.0 | 0.306 |
| 1743.0 | 0.305 |
| 1744.0 | 0.305 |
| 1745.0 | 0.304 |
| 1746.0 | 0.303 |
| 1747.0 | 0.303 |
| 1748.0 | 0.302 |
| 1749.0 | 0.302 |
| 1750.0 | 0.301 |
| 1751.0 | 0.3 |
| 1752.0 | 0.3 |
| 1753.0 | 0.299 |
| 1754.0 | 0.298 |
| 1755.0 | 0.298 |
| 1756.0 | 0.297 |
| 1757.0 | 0.296 |
| 1758.0 | 0.296 |
| 1759.0 | 0.295 |
| 1760.0 | 0.294 |
| 1761.0 | 0.294 |
| 1762.0 | 0.293 |
| 1763.0 | 0.293 |
| 1764.0 | 0.292 |
| 1765.0 | 0.291 |
| 1766.0 | 0.291 |
| 1767.0 | 0.29 |
| 1768.0 | 0.289 |
| 1769.0 | 0.289 |
| 1770.0 | 0.288 |
| 1771.0 | 0.287 |
| 1772.0 | 0.287 |
| 1773.0 | 0.286 |
| 1774.0 | 0.285 |
| 1775.0 | 0.285 |
| 1776.0 | 0.284 |
| 1777.0 | 0.283 |
| 1778.0 | 0.283 |
| 1779.0 | 0.282 |
| 1780.0 | 0.282 |
| 1781.0 | 0.281 |
| 1782.0 | 0.28 |
| 1783.0 | 0.28 |
| 1784.0 | 0.279 |
| 1785.0 | 0.278 |
| 1786.0 | 0.278 |
| 1787.0 | 0.277 |
| 1788.0 | 0.276 |
| 1789.0 | 0.276 |
| 1790.0 | 0.275 |
| 1791.0 | 0.274 |
| 1792.0 | 0.274 |
| 1793.0 | 0.273 |
| 1794.0 | 0.273 |
| 1795.0 | 0.272 |
| 1796.0 | 0.271 |
| 1797.0 | 0.271 |
| 1798.0 | 0.27 |
| 1799.0 | 0.269 |
| 1800.0 | 0.269 |
| 1801.0 | 0.268 |
| 1802.0 | 0.267 |
| 1803.0 | 0.267 |
| 1804.0 | 0.266 |
| 1805.0 | 0.266 |
| 1806.0 | 0.265 |
| 1807.0 | 0.264 |
| 1808.0 | 0.264 |
| 1809.0 | 0.263 |
| 1810.0 | 0.262 |
| 1811.0 | 0.262 |
| 1812.0 | 0.261 |
| 1813.0 | 0.26 |
| 1814.0 | 0.26 |
| 1815.0 | 0.259 |
| 1816.0 | 0.259 |
| 1817.0 | 0.258 |
| 1818.0 | 0.257 |
| 1819.0 | 0.257 |
| 1820.0 | 0.256 |
| 1821.0 | 0.255 |
| 1822.0 | 0.255 |
| 1823.0 | 0.254 |
| 1824.0 | 0.254 |
| 1825.0 | 0.253 |
| 1826.0 | 0.252 |
| 1827.0 | 0.252 |
| 1828.0 | 0.251 |
| 1829.0 | 0.25 |
| 1830.0 | 0.25 |
| 1831.0 | 0.249 |
| 1832.0 | 0.249 |
| 1833.0 | 0.248 |
| 1834.0 | 0.247 |
| 1835.0 | 0.247 |
| 1836.0 | 0.246 |
| 1837.0 | 0.245 |
| 1838.0 | 0.245 |
| 1839.0 | 0.244 |
| 1840.0 | 0.244 |
| 1841.0 | 0.243 |
| 1842.0 | 0.242 |
| 1843.0 | 0.242 |
| 1844.0 | 0.241 |
| 1845.0 | 0.241 |
| 1846.0 | 0.24 |
| 1847.0 | 0.239 |
| 1848.0 | 0.239 |
| 1849.0 | 0.238 |
| 1850.0 | 0.238 |
| 1851.0 | 0.237 |
| 1852.0 | 0.236 |
| 1853.0 | 0.236 |
| 1854.0 | 0.235 |
| 1855.0 | 0.234 |
| 1856.0 | 0.234 |
| 1857.0 | 0.233 |
| 1858.0 | 0.233 |
| 1859.0 | 0.232 |
| 1860.0 | 0.232 |
| 1861.0 | 0.231 |
| 1862.0 | 0.23 |
| 1863.0 | 0.23 |
| 1864.0 | 0.229 |
| 1865.0 | 0.229 |
| 1866.0 | 0.228 |
| 1867.0 | 0.227 |
| 1868.0 | 0.227 |
| 1869.0 | 0.226 |
| 1870.0 | 0.226 |
| 1871.0 | 0.225 |
| 1872.0 | 0.224 |
| 1873.0 | 0.224 |
| 1874.0 | 0.223 |
| 1875.0 | 0.223 |
| 1876.0 | 0.222 |
| 1877.0 | 0.222 |
| 1878.0 | 0.221 |
| 1879.0 | 0.22 |
| 1880.0 | 0.22 |
| 1881.0 | 0.219 |
| 1882.0 | 0.219 |
| 1883.0 | 0.218 |
| 1884.0 | 0.217 |
| 1885.0 | 0.217 |
| 1886.0 | 0.216 |
| 1887.0 | 0.216 |
| 1888.0 | 0.215 |
| 1889.0 | 0.215 |
| 1890.0 | 0.214 |
| 1891.0 | 0.214 |
| 1892.0 | 0.213 |
| 1893.0 | 0.212 |
| 1894.0 | 0.212 |
| 1895.0 | 0.211 |
| 1896.0 | 0.211 |
| 1897.0 | 0.21 |
| 1898.0 | 0.21 |
| 1899.0 | 0.209 |
| 1900.0 | 0.209 |
| 1901.0 | 0.208 |
| 1902.0 | 0.207 |
| 1903.0 | 0.207 |
| 1904.0 | 0.206 |
| 1905.0 | 0.206 |
| 1906.0 | 0.205 |
| 1907.0 | 0.205 |
| 1908.0 | 0.204 |
| 1909.0 | 0.204 |
| 1910.0 | 0.203 |
| 1911.0 | 0.203 |
| 1912.0 | 0.202 |
| 1913.0 | 0.201 |
| 1914.0 | 0.201 |
| 1915.0 | 0.2 |
| 1916.0 | 0.2 |
| 1917.0 | 0.199 |
| 1918.0 | 0.199 |
| 1919.0 | 0.198 |
| 1920.0 | 0.198 |
| 1921.0 | 0.197 |
| 1922.0 | 0.197 |
| 1923.0 | 0.196 |
| 1924.0 | 0.196 |
| 1925.0 | 0.195 |
| 1926.0 | 0.195 |
| 1927.0 | 0.194 |
| 1928.0 | 0.194 |
| 1929.0 | 0.193 |
| 1930.0 | 0.193 |
| 1931.0 | 0.192 |
| 1932.0 | 0.191 |
| 1933.0 | 0.191 |
| 1934.0 | 0.19 |
| 1935.0 | 0.19 |
| 1936.0 | 0.189 |
| 1937.0 | 0.189 |
| 1938.0 | 0.188 |
| 1939.0 | 0.188 |
| 1940.0 | 0.187 |
| 1941.0 | 0.187 |
| 1942.0 | 0.186 |
| 1943.0 | 0.186 |
| 1944.0 | 0.185 |
| 1945.0 | 0.185 |
| 1946.0 | 0.184 |
| 1947.0 | 0.184 |
| 1948.0 | 0.183 |
| 1949.0 | 0.183 |
| 1950.0 | 0.182 |
| 1951.0 | 0.182 |
| 1952.0 | 0.182 |
| 1953.0 | 0.181 |
| 1954.0 | 0.181 |
| 1955.0 | 0.18 |
| 1956.0 | 0.18 |
| 1957.0 | 0.179 |
| 1958.0 | 0.179 |
| 1959.0 | 0.178 |
| 1960.0 | 0.178 |
| 1961.0 | 0.177 |
| 1962.0 | 0.177 |
| 1963.0 | 0.176 |
| 1964.0 | 0.176 |
| 1965.0 | 0.175 |
| 1966.0 | 0.175 |
| 1967.0 | 0.174 |
| 1968.0 | 0.174 |
| 1969.0 | 0.173 |
| 1970.0 | 0.173 |
| 1971.0 | 0.173 |
| 1972.0 | 0.172 |
| 1973.0 | 0.172 |
| 1974.0 | 0.171 |
| 1975.0 | 0.171 |
| 1976.0 | 0.17 |
| 1977.0 | 0.17 |
| 1978.0 | 0.169 |
| 1979.0 | 0.169 |
| 1980.0 | 0.168 |
| 1981.0 | 0.168 |
| 1982.0 | 0.168 |
| 1983.0 | 0.167 |
| 1984.0 | 0.167 |
| 1985.0 | 0.166 |
| 1986.0 | 0.166 |
| 1987.0 | 0.165 |
| 1988.0 | 0.165 |
| 1989.0 | 0.164 |
| 1990.0 | 0.164 |
| 1991.0 | 0.164 |
| 1992.0 | 0.163 |
| 1993.0 | 0.163 |
| 1994.0 | 0.162 |
| 1995.0 | 0.162 |
| 1996.0 | 0.161 |
| 1997.0 | 0.161 |
| 1998.0 | 0.161 |
| 1999.0 | 0.16 |
| 2000.0 | 0.16 |
| 2001.0 | 0.159 |
| 2002.0 | 0.159 |
| 2003.0 | 0.158 |
| 2004.0 | 0.158 |
| 2005.0 | 0.158 |
| 2006.0 | 0.157 |
| 2007.0 | 0.157 |
| 2008.0 | 0.156 |
| 2009.0 | 0.156 |
| 2010.0 | 0.156 |
| 2011.0 | 0.155 |
| 2012.0 | 0.155 |
| 2013.0 | 0.154 |
| 2014.0 | 0.154 |
| 2015.0 | 0.153 |
| 2016.0 | 0.153 |
| 2017.0 | 0.153 |
| 2018.0 | 0.152 |
| 2019.0 | 0.152 |
| 2020.0 | 0.151 |
| 2021.0 | 0.151 |
| 2022.0 | 0.151 |
| 2023.0 | 0.15 |
| 2024.0 | 0.15 |
| 2025.0 | 0.15 |
| 2026.0 | 0.149 |
| 2027.0 | 0.149 |
| 2028.0 | 0.148 |
| 2029.0 | 0.148 |
| 2030.0 | 0.148 |
| 2031.0 | 0.147 |
| 2032.0 | 0.147 |
| 2033.0 | 0.146 |
| 2034.0 | 0.146 |
| 2035.0 | 0.146 |
| 2036.0 | 0.145 |
| 2037.0 | 0.145 |
| 2038.0 | 0.145 |
| 2039.0 | 0.144 |
| 2040.0 | 0.144 |
| 2041.0 | 0.143 |
| 2042.0 | 0.143 |
| 2043.0 | 0.143 |
| 2044.0 | 0.142 |
| 2045.0 | 0.142 |
| 2046.0 | 0.142 |
| 2047.0 | 0.141 |
| 2048.0 | 0.141 |
| 2049.0 | 0.14 |
| 2050.0 | 0.14 |
| 2051.0 | 0.14 |
| 2052.0 | 0.139 |
| 2053.0 | 0.139 |
| 2054.0 | 0.139 |
| 2055.0 | 0.138 |
| 2056.0 | 0.138 |
| 2057.0 | 0.138 |
| 2058.0 | 0.137 |
| 2059.0 | 0.137 |
| 2060.0 | 0.137 |
| 2061.0 | 0.136 |
| 2062.0 | 0.136 |
| 2063.0 | 0.136 |
| 2064.0 | 0.135 |
| 2065.0 | 0.135 |
| 2066.0 | 0.134 |
| 2067.0 | 0.134 |
| 2068.0 | 0.134 |
| 2069.0 | 0.133 |
| 2070.0 | 0.133 |
| 2071.0 | 0.133 |
| 2072.0 | 0.132 |
| 2073.0 | 0.132 |
| 2074.0 | 0.132 |
| 2075.0 | 0.131 |
| 2076.0 | 0.131 |
| 2077.0 | 0.131 |
| 2078.0 | 0.13 |
| 2079.0 | 0.13 |
| 2080.0 | 0.13 |
| 2081.0 | 0.129 |
| 2082.0 | 0.129 |
| 2083.0 | 0.129 |
| 2084.0 | 0.128 |
| 2085.0 | 0.128 |
| 2086.0 | 0.128 |
| 2087.0 | 0.127 |
| 2088.0 | 0.127 |
| 2089.0 | 0.127 |
| 2090.0 | 0.127 |
| 2091.0 | 0.126 |
| 2092.0 | 0.126 |
| 2093.0 | 0.126 |
| 2094.0 | 0.125 |
| 2095.0 | 0.125 |
| 2096.0 | 0.125 |
| 2097.0 | 0.124 |
| 2098.0 | 0.124 |
| 2099.0 | 0.124 |
| 2100.0 | 0.123 |
| 2101.0 | 0.123 |
| 2102.0 | 0.123 |
| 2103.0 | 0.123 |
| 2104.0 | 0.122 |
| 2105.0 | 0.122 |
| 2106.0 | 0.122 |
| 2107.0 | 0.121 |
| 2108.0 | 0.121 |
| 2109.0 | 0.121 |
| 2110.0 | 0.12 |
| 2111.0 | 0.12 |
| 2112.0 | 0.12 |
| 2113.0 | 0.12 |
| 2114.0 | 0.119 |
| 2115.0 | 0.119 |
| 2116.0 | 0.119 |
| 2117.0 | 0.118 |
| 2118.0 | 0.118 |
| 2119.0 | 0.118 |
| 2120.0 | 0.117 |
| 2121.0 | 0.117 |
| 2122.0 | 0.117 |
| 2123.0 | 0.117 |
| 2124.0 | 0.116 |
| 2125.0 | 0.116 |
| 2126.0 | 0.116 |
| 2127.0 | 0.115 |
| 2128.0 | 0.115 |
| 2129.0 | 0.115 |
| 2130.0 | 0.115 |
| 2131.0 | 0.114 |
| 2132.0 | 0.114 |
| 2133.0 | 0.114 |
| 2134.0 | 0.114 |
| 2135.0 | 0.113 |
| 2136.0 | 0.113 |
| 2137.0 | 0.113 |
| 2138.0 | 0.112 |
| 2139.0 | 0.112 |
| 2140.0 | 0.112 |
| 2141.0 | 0.112 |
| 2142.0 | 0.111 |
| 2143.0 | 0.111 |
| 2144.0 | 0.111 |
| 2145.0 | 0.111 |
| 2146.0 | 0.11 |
| 2147.0 | 0.11 |
| 2148.0 | 0.11 |
| 2149.0 | 0.11 |
| 2150.0 | 0.109 |
| 2151.0 | 0.109 |
| 2152.0 | 0.109 |
| 2153.0 | 0.108 |
| 2154.0 | 0.108 |
| 2155.0 | 0.108 |
| 2156.0 | 0.108 |
| 2157.0 | 0.107 |
| 2158.0 | 0.107 |
| 2159.0 | 0.107 |
| 2160.0 | 0.107 |
| 2161.0 | 0.106 |
| 2162.0 | 0.106 |
| 2163.0 | 0.106 |
| 2164.0 | 0.106 |
| 2165.0 | 0.105 |
| 2166.0 | 0.105 |
| 2167.0 | 0.105 |
| 2168.0 | 0.105 |
| 2169.0 | 0.104 |
| 2170.0 | 0.104 |
| 2171.0 | 0.104 |
| 2172.0 | 0.104 |
| 2173.0 | 0.104 |
| 2174.0 | 0.103 |
| 2175.0 | 0.103 |
| 2176.0 | 0.103 |
| 2177.0 | 0.103 |
| 2178.0 | 0.102 |
| 2179.0 | 0.102 |
| 2180.0 | 0.102 |
| 2181.0 | 0.102 |
| 2182.0 | 0.101 |
| 2183.0 | 0.101 |
| 2184.0 | 0.101 |
| 2185.0 | 0.101 |
| 2186.0 | 0.1 |
| 2187.0 | 0.1 |
| 2188.0 | 0.1 |
| 2189.0 | 0.1 |
| 2190.0 | 0.1 |
| 2191.0 | 0.099 |
| 2192.0 | 0.099 |
| 2193.0 | 0.099 |
| 2194.0 | 0.099 |
| 2195.0 | 0.098 |
| 2196.0 | 0.098 |
| 2197.0 | 0.098 |
| 2198.0 | 0.098 |
| 2199.0 | 0.098 |
| 2200.0 | 0.097 |
| 2201.0 | 0.097 |
| 2202.0 | 0.097 |
| 2203.0 | 0.097 |
| 2204.0 | 0.096 |
| 2205.0 | 0.096 |
| 2206.0 | 0.096 |
| 2207.0 | 0.096 |
| 2208.0 | 0.096 |
| 2209.0 | 0.095 |
| 2210.0 | 0.095 |
| 2211.0 | 0.095 |
| 2212.0 | 0.095 |
| 2213.0 | 0.094 |
| 2214.0 | 0.094 |
| 2215.0 | 0.094 |
| 2216.0 | 0.094 |
| 2217.0 | 0.094 |
| 2218.0 | 0.093 |
| 2219.0 | 0.093 |
| 2220.0 | 0.093 |
| 2221.0 | 0.093 |
| 2222.0 | 0.093 |
| 2223.0 | 0.092 |
| 2224.0 | 0.092 |
| 2225.0 | 0.092 |
| 2226.0 | 0.092 |
| 2227.0 | 0.092 |
| 2228.0 | 0.091 |
| 2229.0 | 0.091 |
| 2230.0 | 0.091 |
| 2231.0 | 0.091 |
| 2232.0 | 0.091 |
| 2233.0 | 0.09 |
| 2234.0 | 0.09 |
| 2235.0 | 0.09 |
| 2236.0 | 0.09 |
| 2237.0 | 0.09 |
| 2238.0 | 0.089 |
| 2239.0 | 0.089 |
| 2240.0 | 0.089 |
| 2241.0 | 0.089 |
| 2242.0 | 0.089 |
| 2243.0 | 0.088 |
| 2244.0 | 0.088 |
| 2245.0 | 0.088 |
| 2246.0 | 0.088 |
| 2247.0 | 0.088 |
| 2248.0 | 0.088 |
| 2249.0 | 0.087 |
| 2250.0 | 0.087 |
| 2251.0 | 0.087 |
| 2252.0 | 0.087 |
| 2253.0 | 0.087 |
| 2254.0 | 0.086 |
| 2255.0 | 0.086 |
| 2256.0 | 0.086 |
| 2257.0 | 0.086 |
| 2258.0 | 0.086 |
| 2259.0 | 0.085 |
| 2260.0 | 0.085 |
| 2261.0 | 0.085 |
| 2262.0 | 0.085 |
| 2263.0 | 0.085 |
| 2264.0 | 0.085 |
| 2265.0 | 0.084 |
| 2266.0 | 0.084 |
| 2267.0 | 0.084 |
| 2268.0 | 0.084 |
| 2269.0 | 0.084 |
| 2270.0 | 0.084 |
| 2271.0 | 0.083 |
| 2272.0 | 0.083 |
| 2273.0 | 0.083 |
| 2274.0 | 0.083 |
| 2275.0 | 0.083 |
| 2276.0 | 0.082 |
| 2277.0 | 0.082 |
| 2278.0 | 0.082 |
| 2279.0 | 0.082 |
| 2280.0 | 0.082 |
| 2281.0 | 0.082 |
| 2282.0 | 0.081 |
| 2283.0 | 0.081 |
| 2284.0 | 0.081 |
| 2285.0 | 0.081 |
| 2286.0 | 0.081 |
| 2287.0 | 0.081 |
| 2288.0 | 0.08 |
| 2289.0 | 0.08 |
| 2290.0 | 0.08 |
| 2291.0 | 0.08 |
| 2292.0 | 0.08 |
| 2293.0 | 0.08 |
| 2294.0 | 0.079 |
| 2295.0 | 0.079 |
| 2296.0 | 0.079 |
| 2297.0 | 0.079 |
| 2298.0 | 0.079 |
| 2299.0 | 0.079 |
| 2300.0 | 0.079 |
| 2301.0 | 0.078 |
| 2302.0 | 0.078 |
| 2303.0 | 0.078 |
| 2304.0 | 0.078 |
| 2305.0 | 0.078 |
| 2306.0 | 0.078 |
| 2307.0 | 0.077 |
| 2308.0 | 0.077 |
| 2309.0 | 0.077 |
| 2310.0 | 0.077 |
| 2311.0 | 0.077 |
| 2312.0 | 0.077 |
| 2313.0 | 0.076 |
| 2314.0 | 0.076 |
| 2315.0 | 0.076 |
| 2316.0 | 0.076 |
| 2317.0 | 0.076 |
| 2318.0 | 0.076 |
| 2319.0 | 0.076 |
| 2320.0 | 0.075 |
| 2321.0 | 0.075 |
| 2322.0 | 0.075 |
| 2323.0 | 0.075 |
| 2324.0 | 0.075 |
| 2325.0 | 0.075 |
| 2326.0 | 0.075 |
| 2327.0 | 0.074 |
| 2328.0 | 0.074 |
| 2329.0 | 0.074 |
| 2330.0 | 0.074 |
| 2331.0 | 0.074 |
| 2332.0 | 0.074 |
| 2333.0 | 0.074 |
| 2334.0 | 0.073 |
| 2335.0 | 0.073 |
| 2336.0 | 0.073 |
| 2337.0 | 0.073 |
| 2338.0 | 0.073 |
| 2339.0 | 0.073 |
| 2340.0 | 0.073 |
| 2341.0 | 0.072 |
| 2342.0 | 0.072 |
| 2343.0 | 0.072 |
| 2344.0 | 0.072 |
| 2345.0 | 0.072 |
| 2346.0 | 0.072 |
| 2347.0 | 0.072 |
| 2348.0 | 0.071 |
| 2349.0 | 0.071 |
| 2350.0 | 0.071 |
| 2351.0 | 0.071 |
| 2352.0 | 0.071 |
| 2353.0 | 0.071 |
| 2354.0 | 0.071 |
| 2355.0 | 0.07 |
| 2356.0 | 0.07 |
| 2357.0 | 0.07 |
| 2358.0 | 0.07 |
| 2359.0 | 0.07 |
| 2360.0 | 0.07 |
| 2361.0 | 0.07 |
| 2362.0 | 0.07 |
| 2363.0 | 0.069 |
| 2364.0 | 0.069 |
| 2365.0 | 0.069 |
| 2366.0 | 0.069 |
| 2367.0 | 0.069 |
| 2368.0 | 0.069 |
| 2369.0 | 0.069 |
| 2370.0 | 0.068 |
| 2371.0 | 0.068 |
| 2372.0 | 0.068 |
| 2373.0 | 0.068 |
| 2374.0 | 0.068 |
| 2375.0 | 0.068 |
| 2376.0 | 0.068 |
| 2377.0 | 0.068 |
| 2378.0 | 0.067 |
| 2379.0 | 0.067 |
| 2380.0 | 0.067 |
| 2381.0 | 0.067 |
| 2382.0 | 0.067 |
| 2383.0 | 0.067 |
| 2384.0 | 0.067 |
| 2385.0 | 0.067 |
| 2386.0 | 0.066 |
| 2387.0 | 0.066 |
| 2388.0 | 0.066 |
| 2389.0 | 0.066 |
| 2390.0 | 0.066 |
| 2391.0 | 0.066 |
| 2392.0 | 0.066 |
| 2393.0 | 0.066 |
| 2394.0 | 0.065 |
| 2395.0 | 0.065 |
| 2396.0 | 0.065 |
| 2397.0 | 0.065 |
| 2398.0 | 0.065 |
| 2399.0 | 0.065 |
| 2400.0 | 0.065 |
| 2401.0 | 0.065 |
| 2402.0 | 0.065 |
| 2403.0 | 0.064 |
| 2404.0 | 0.064 |
| 2405.0 | 0.064 |
| 2406.0 | 0.064 |
| 2407.0 | 0.064 |
| 2408.0 | 0.064 |
| 2409.0 | 0.064 |
| 2410.0 | 0.064 |
| 2411.0 | 0.064 |
| 2412.0 | 0.063 |
| 2413.0 | 0.063 |
| 2414.0 | 0.063 |
| 2415.0 | 0.063 |
| 2416.0 | 0.063 |
| 2417.0 | 0.063 |
| 2418.0 | 0.063 |
| 2419.0 | 0.063 |
| 2420.0 | 0.062 |
| 2421.0 | 0.062 |
| 2422.0 | 0.062 |
| 2423.0 | 0.062 |
| 2424.0 | 0.062 |
| 2425.0 | 0.062 |
| 2426.0 | 0.062 |
| 2427.0 | 0.062 |
| 2428.0 | 0.062 |
| 2429.0 | 0.062 |
| 2430.0 | 0.061 |
| 2431.0 | 0.061 |
| 2432.0 | 0.061 |
| 2433.0 | 0.061 |
| 2434.0 | 0.061 |
| 2435.0 | 0.061 |
| 2436.0 | 0.061 |
| 2437.0 | 0.061 |
| 2438.0 | 0.061 |
| 2439.0 | 0.06 |
| 2440.0 | 0.06 |
| 2441.0 | 0.06 |
| 2442.0 | 0.06 |
| 2443.0 | 0.06 |
| 2444.0 | 0.06 |
| 2445.0 | 0.06 |
| 2446.0 | 0.06 |
| 2447.0 | 0.06 |
| 2448.0 | 0.06 |
| 2449.0 | 0.059 |
| 2450.0 | 0.059 |
| 2451.0 | 0.059 |
| 2452.0 | 0.059 |
| 2453.0 | 0.059 |
| 2454.0 | 0.059 |
| 2455.0 | 0.059 |
| 2456.0 | 0.059 |
| 2457.0 | 0.059 |
| 2458.0 | 0.058 |
| 2459.0 | 0.058 |
| 2460.0 | 0.058 |
| 2461.0 | 0.058 |
| 2462.0 | 0.058 |
| 2463.0 | 0.058 |
| 2464.0 | 0.058 |
| 2465.0 | 0.058 |
| 2466.0 | 0.058 |
| 2467.0 | 0.058 |
| 2468.0 | 0.058 |
| 2469.0 | 0.057 |
| 2470.0 | 0.057 |
| 2471.0 | 0.057 |
| 2472.0 | 0.057 |
| 2473.0 | 0.057 |
| 2474.0 | 0.057 |
| 2475.0 | 0.057 |
| 2476.0 | 0.057 |
| 2477.0 | 0.057 |
| 2478.0 | 0.057 |
| 2479.0 | 0.056 |
| 2480.0 | 0.056 |
| 2481.0 | 0.056 |
| 2482.0 | 0.056 |
| 2483.0 | 0.056 |
| 2484.0 | 0.056 |
| 2485.0 | 0.056 |
| 2486.0 | 0.056 |
| 2487.0 | 0.056 |
| 2488.0 | 0.056 |
| 2489.0 | 0.056 |
| 2490.0 | 0.055 |
| 2491.0 | 0.055 |
| 2492.0 | 0.055 |
| 2493.0 | 0.055 |
| 2494.0 | 0.055 |
| 2495.0 | 0.055 |
| 2496.0 | 0.055 |
| 2497.0 | 0.055 |
| 2498.0 | 0.055 |
| 2499.0 | 0.055 |
| 2500.0 | 0.055 |
| 2501.0 | 0.054 |
| 2502.0 | 0.054 |
| 2503.0 | 0.054 |
| 2504.0 | 0.054 |
| 2505.0 | 0.054 |
| 2506.0 | 0.054 |
| 2507.0 | 0.054 |
| 2508.0 | 0.054 |
| 2509.0 | 0.054 |
| 2510.0 | 0.054 |
| 2511.0 | 0.054 |
| 2512.0 | 0.053 |
| 2513.0 | 0.053 |
| 2514.0 | 0.053 |
| 2515.0 | 0.053 |
| 2516.0 | 0.053 |
| 2517.0 | 0.053 |
| 2518.0 | 0.053 |
| 2519.0 | 0.053 |
| 2520.0 | 0.053 |
| 2521.0 | 0.053 |
| 2522.0 | 0.053 |
| 2523.0 | 0.053 |
| 2524.0 | 0.052 |
| 2525.0 | 0.052 |
| 2526.0 | 0.052 |
| 2527.0 | 0.052 |
| 2528.0 | 0.052 |
| 2529.0 | 0.052 |
| 2530.0 | 0.052 |
| 2531.0 | 0.052 |
| 2532.0 | 0.052 |
| 2533.0 | 0.052 |
| 2534.0 | 0.052 |
| 2535.0 | 0.052 |
| 2536.0 | 0.051 |
| 2537.0 | 0.051 |
| 2538.0 | 0.051 |
| 2539.0 | 0.051 |
| 2540.0 | 0.051 |
| 2541.0 | 0.051 |
| 2542.0 | 0.051 |
| 2543.0 | 0.051 |
| 2544.0 | 0.051 |
| 2545.0 | 0.051 |
| 2546.0 | 0.051 |
| 2547.0 | 0.051 |
| 2548.0 | 0.051 |
| 2549.0 | 0.05 |
| 2550.0 | 0.05 |
| 2551.0 | 0.05 |
| 2552.0 | 0.05 |
| 2553.0 | 0.05 |
| 2554.0 | 0.05 |
| 2555.0 | 0.05 |